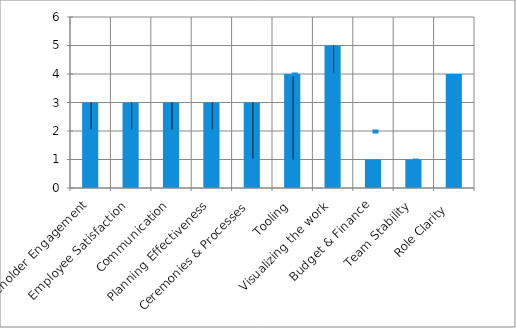
| Category | Series 2 |
|---|---|
| Stakeholder Engagement | 3 |
| Employee Satisfaction | 3 |
| Communication | 3 |
| Planning Effectiveness | 3 |
| Ceremonies & Processes | 3 |
| Tooling | 4 |
| Visualizing the work | 5 |
| Budget & Finance | 1 |
| Team Stability | 1 |
| Role Clarity  | 4 |